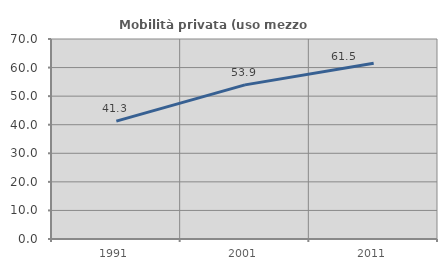
| Category | Mobilità privata (uso mezzo privato) |
|---|---|
| 1991.0 | 41.251 |
| 2001.0 | 53.942 |
| 2011.0 | 61.538 |